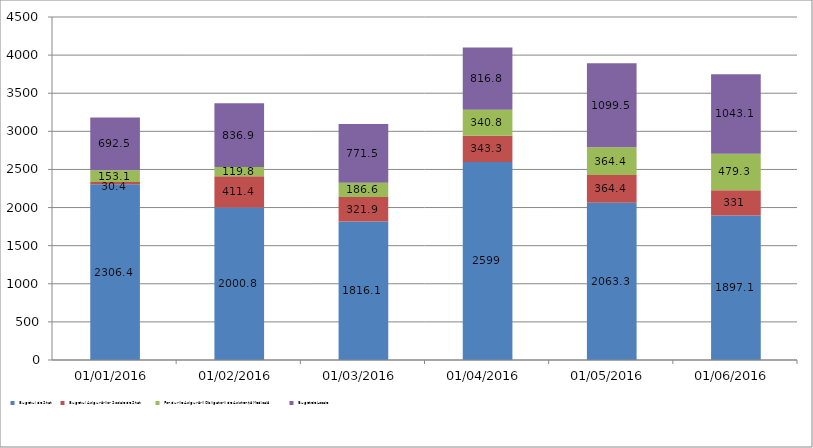
| Category | Bugetul de Stat | Bugetul Asigurărilor Sociale de Stat | Fondurile Asigurării Obligatorii de Asistență Medicală | Bugetele Locale |
|---|---|---|---|---|
| 01/01/2016 | 2306.4 | 30.4 | 153.1 | 692.5 |
| 01/02/2016 | 2000.8 | 411.4 | 119.8 | 836.9 |
| 01/03/2016 | 1816.1 | 321.9 | 186.6 | 771.5 |
| 01/04/2016 | 2599 | 343.3 | 340.8 | 816.8 |
| 01/05/2016 | 2063.3 | 364.4 | 364.4 | 1099.5 |
| 01/06/2016 | 1897.1 | 331 | 479.3 | 1043.1 |